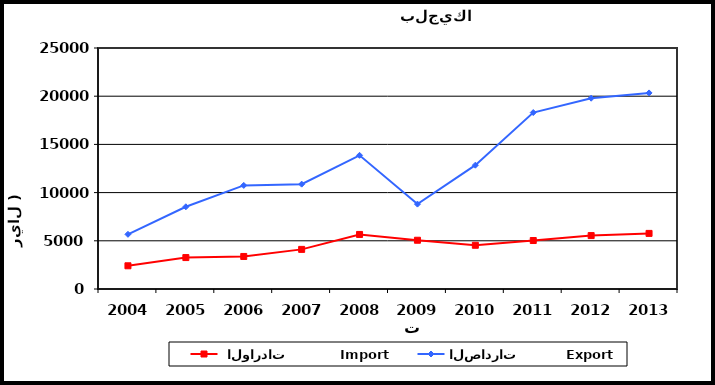
| Category |  الواردات           Import | الصادرات          Export |
|---|---|---|
| 2004.0 | 2407 | 5673 |
| 2005.0 | 3261 | 8528 |
| 2006.0 | 3376 | 10746 |
| 2007.0 | 4109 | 10877 |
| 2008.0 | 5660 | 13867 |
| 2009.0 | 5058 | 8807 |
| 2010.0 | 4536 | 12845 |
| 2011.0 | 5028 | 18305 |
| 2012.0 | 5541 | 19793 |
| 2013.0 | 5767 | 20340 |